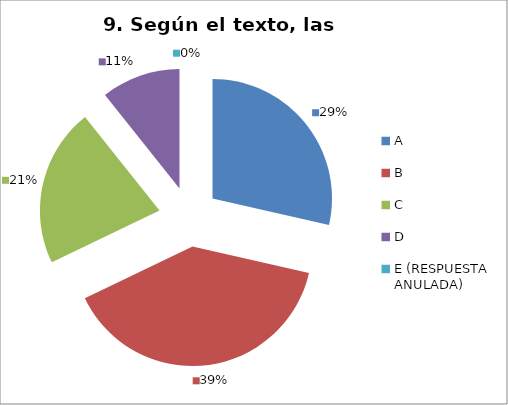
| Category | CANTIDAD DE RESPUESTAS PREGUNTA (9) | PORCENTAJE |
|---|---|---|
| A | 8 | 0.286 |
| B | 11 | 0.393 |
| C | 6 | 0.214 |
| D | 3 | 0.107 |
| E (RESPUESTA ANULADA) | 0 | 0 |